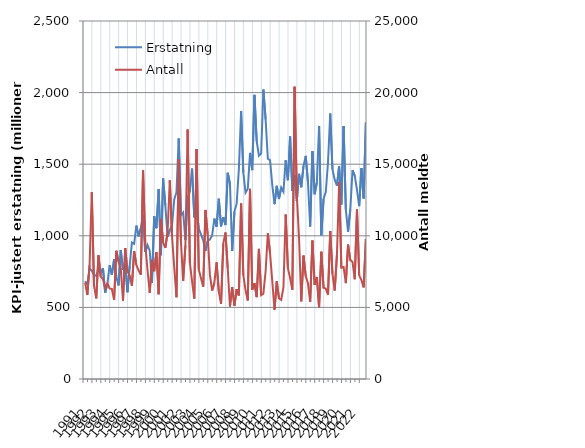
| Category | Erstatning |
|---|---|
| 1991.0 | 682.861 |
| nan | 660.593 |
| nan | 770.781 |
| nan | 757.68 |
| 1992.0 | 724.967 |
| nan | 720.337 |
| nan | 769.124 |
| nan | 738.283 |
| 1993.0 | 775.228 |
| nan | 602.058 |
| nan | 664.256 |
| nan | 794.965 |
| 1994.0 | 727.895 |
| nan | 835.014 |
| nan | 715.669 |
| nan | 653.422 |
| 1995.0 | 900.586 |
| nan | 761.203 |
| nan | 803.181 |
| nan | 605.711 |
| 1996.0 | 789.173 |
| nan | 953.39 |
| nan | 943.881 |
| nan | 1071.001 |
| 1997.0 | 996.152 |
| nan | 1053.434 |
| nan | 1142.066 |
| nan | 887.884 |
| 1998.0 | 935.373 |
| nan | 896.35 |
| nan | 671.783 |
| nan | 1136.193 |
| 1999.0 | 1052.729 |
| nan | 1325.657 |
| nan | 863.644 |
| nan | 1400.154 |
| 2000.0 | 1214.232 |
| nan | 993.707 |
| nan | 1038.895 |
| nan | 1072.169 |
| 2001.0 | 1253.265 |
| nan | 1304.559 |
| nan | 1679.765 |
| nan | 1144.776 |
| 2002.0 | 1162.727 |
| nan | 970.425 |
| nan | 1266.256 |
| nan | 1309.736 |
| 2003.0 | 1469.594 |
| nan | 1128.08 |
| nan | 1190.808 |
| nan | 1048.721 |
| 2004.0 | 1011.439 |
| nan | 967.557 |
| nan | 894.762 |
| nan | 963.959 |
| 2005.0 | 974.405 |
| nan | 1002.461 |
| nan | 1119.883 |
| nan | 1062.719 |
| 2006.0 | 1258.391 |
| nan | 1065.827 |
| nan | 1130.31 |
| nan | 1075.24 |
| 2007.0 | 1439.915 |
| nan | 1364.05 |
| nan | 893.677 |
| nan | 1169.116 |
| 2008.0 | 1224.519 |
| nan | 1465.019 |
| nan | 1870.593 |
| nan | 1441 |
| 2009.0 | 1301.099 |
| nan | 1328.36 |
| nan | 1578.846 |
| nan | 1458.773 |
| 2010.0 | 1984.188 |
| nan | 1660.479 |
| nan | 1559.014 |
| nan | 1574.052 |
| 2011.0 | 2021.055 |
| nan | 1813.246 |
| nan | 1538.78 |
| nan | 1527.545 |
| 2012.0 | 1353.017 |
| nan | 1220.672 |
| nan | 1348.959 |
| nan | 1256.877 |
| 2013.0 | 1337.311 |
| nan | 1307.667 |
| nan | 1527.592 |
| nan | 1388.401 |
| 2014.0 | 1693.847 |
| nan | 1313.108 |
| nan | 1424.554 |
| nan | 1243.361 |
| 2015.0 | 1432.487 |
| nan | 1339.063 |
| nan | 1487.095 |
| nan | 1558.19 |
| 2016.0 | 1375.58 |
| nan | 1064.405 |
| nan | 1591.137 |
| nan | 1290.489 |
| 2017.0 | 1371.785 |
| nan | 1767.479 |
| nan | 1003.271 |
| nan | 1257.841 |
| 2018.0 | 1305.9 |
| nan | 1512.06 |
| nan | 1853.654 |
| nan | 1464.441 |
| 2019.0 | 1391.758 |
| nan | 1349.421 |
| nan | 1486.971 |
| nan | 1218.36 |
| 2020.0 | 1766.411 |
| nan | 1183.175 |
| nan | 1028.68 |
| nan | 1183.099 |
| 2021.0 | 1458.431 |
| nan | 1419.051 |
| nan | 1321.794 |
| nan | 1207.092 |
| 2022.0 | 1472.703 |
| nan | 1260.294 |
| nan | 1793.257 |